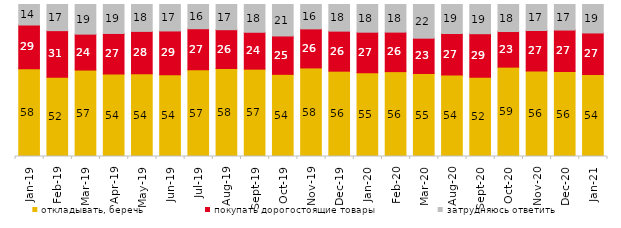
| Category | откладывать, беречь | покупать дорогостоящие товары | затрудняюсь ответить |
|---|---|---|---|
| 2019-01-01 | 57.8 | 28.7 | 13.5 |
| 2019-02-01 | 52.1 | 30.7 | 17.2 |
| 2019-03-01 | 56.887 | 23.62 | 19.493 |
| 2019-04-01 | 54.356 | 26.584 | 19.059 |
| 2019-05-01 | 54.383 | 27.935 | 17.682 |
| 2019-06-01 | 53.815 | 28.778 | 17.406 |
| 2019-07-01 | 57.079 | 26.98 | 15.941 |
| 2019-08-01 | 57.892 | 25.524 | 16.583 |
| 2019-09-01 | 57.475 | 24.257 | 18.267 |
| 2019-10-01 | 54.059 | 25.248 | 20.693 |
| 2019-11-01 | 58.267 | 25.693 | 16.04 |
| 2019-12-01 | 56.139 | 26.337 | 17.525 |
| 2020-01-01 | 55.099 | 26.683 | 18.218 |
| 2020-02-01 | 55.842 | 25.99 | 18.168 |
| 2020-03-01 | 54.586 | 23.252 | 22.162 |
| 2020-08-01 | 53.625 | 27.309 | 19.067 |
| 2020-09-01 | 52.165 | 28.621 | 19.214 |
| 2020-10-01 | 58.794 | 23.418 | 17.788 |
| 2020-11-01 | 56.2 | 26.7 | 17.1 |
| 2020-12-01 | 55.875 | 27.318 | 16.807 |
| 2021-01-01 | 53.949 | 27.322 | 18.728 |